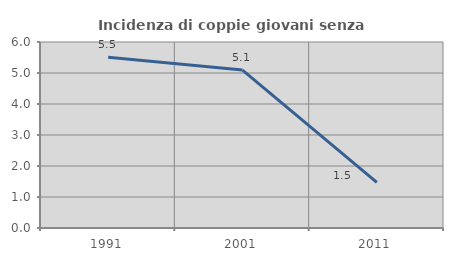
| Category | Incidenza di coppie giovani senza figli |
|---|---|
| 1991.0 | 5.507 |
| 2001.0 | 5.094 |
| 2011.0 | 1.47 |